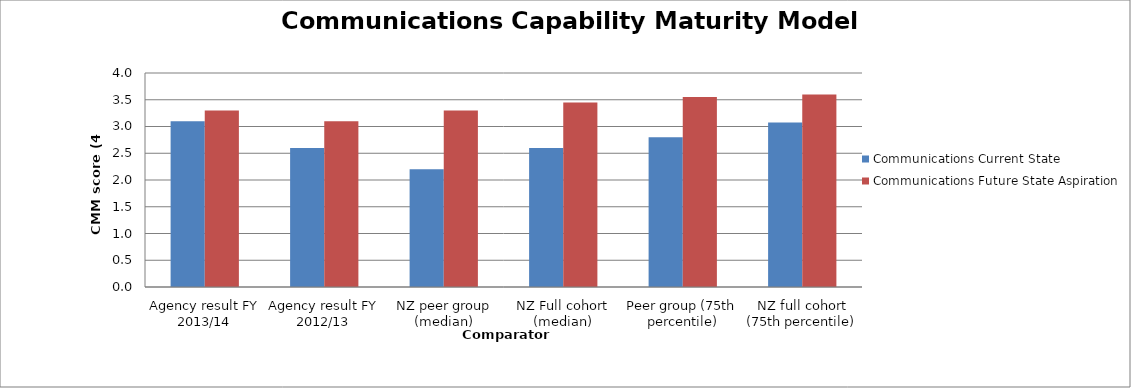
| Category | Communications Current State | Communications Future State Aspiration |
|---|---|---|
| Agency result FY 2013/14 | 3.1 | 3.3 |
| Agency result FY 2012/13 | 2.6 | 3.1 |
| NZ peer group (median) | 2.2 | 3.3 |
| NZ Full cohort (median) | 2.6 | 3.45 |
| Peer group (75th percentile) | 2.8 | 3.55 |
| NZ full cohort (75th percentile) | 3.075 | 3.6 |